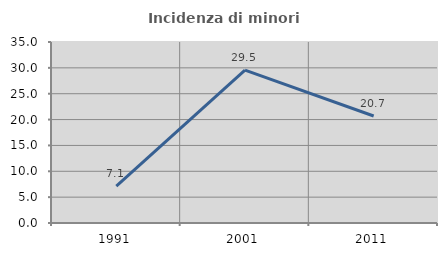
| Category | Incidenza di minori stranieri |
|---|---|
| 1991.0 | 7.143 |
| 2001.0 | 29.545 |
| 2011.0 | 20.69 |